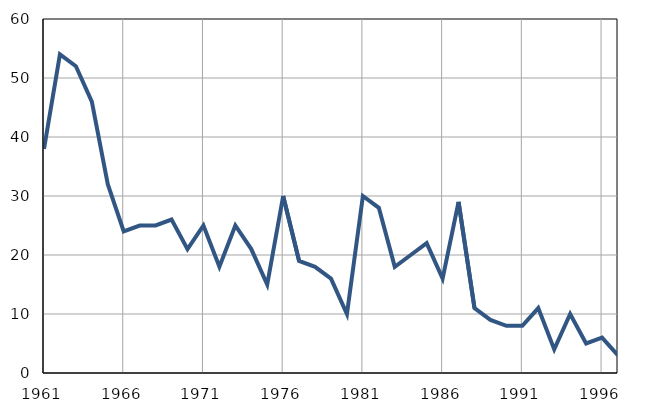
| Category | Infants
deaths |
|---|---|
| 1961.0 | 38 |
| 1962.0 | 54 |
| 1963.0 | 52 |
| 1964.0 | 46 |
| 1965.0 | 32 |
| 1966.0 | 24 |
| 1967.0 | 25 |
| 1968.0 | 25 |
| 1969.0 | 26 |
| 1970.0 | 21 |
| 1971.0 | 25 |
| 1972.0 | 18 |
| 1973.0 | 25 |
| 1974.0 | 21 |
| 1975.0 | 15 |
| 1976.0 | 30 |
| 1977.0 | 19 |
| 1978.0 | 18 |
| 1979.0 | 16 |
| 1980.0 | 10 |
| 1981.0 | 30 |
| 1982.0 | 28 |
| 1983.0 | 18 |
| 1984.0 | 20 |
| 1985.0 | 22 |
| 1986.0 | 16 |
| 1987.0 | 29 |
| 1988.0 | 11 |
| 1989.0 | 9 |
| 1990.0 | 8 |
| 1991.0 | 8 |
| 1992.0 | 11 |
| 1993.0 | 4 |
| 1994.0 | 10 |
| 1995.0 | 5 |
| 1996.0 | 6 |
| 1997.0 | 3 |